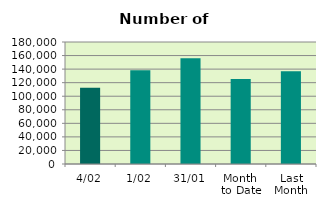
| Category | Series 0 |
|---|---|
| 4/02 | 112450 |
| 1/02 | 138198 |
| 31/01 | 156186 |
| Month 
to Date | 125324 |
| Last
Month | 136846.364 |